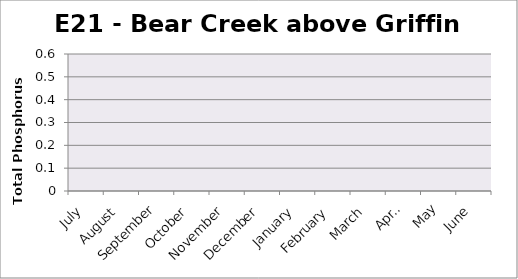
| Category | Phosphorus (mg/L) |
|---|---|
| July | 0 |
| August | 0 |
| September | 0 |
| October | 0 |
| November | 0 |
| December | 0 |
| January | 0 |
| February | 0 |
| March | 0 |
| April | 0 |
| May | 0 |
| June | 0 |